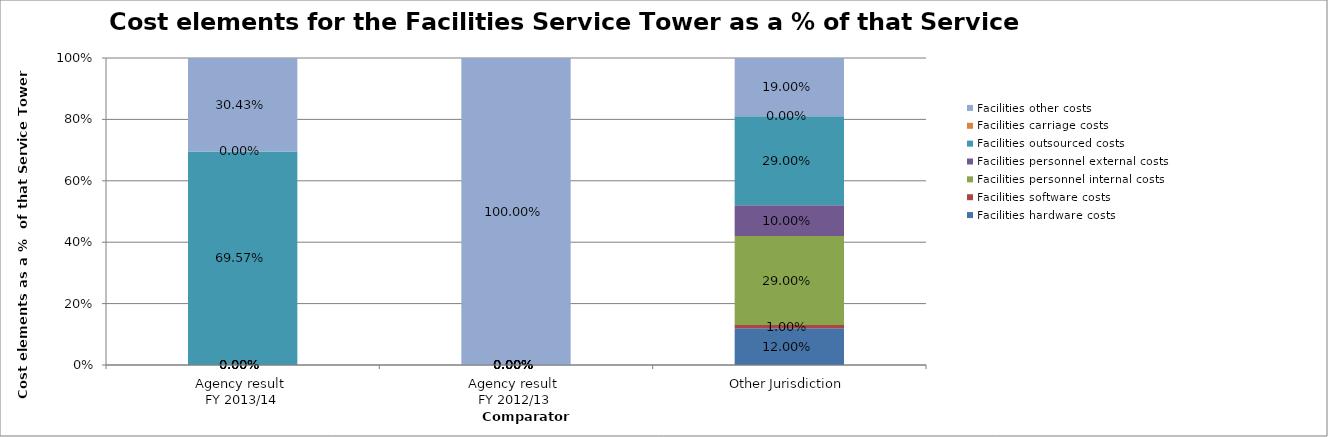
| Category | Facilities hardware costs | Facilities software costs | Facilities personnel internal costs | Facilities personnel external costs | Facilities outsourced costs | Facilities carriage costs | Facilities other costs |
|---|---|---|---|---|---|---|---|
| Agency result 
FY 2013/14 | 0 | 0 | 0 | 0 | 0.696 | 0 | 0.304 |
| Agency result 
FY 2012/13 | 0 | 0 | 0 | 0 | 0 | 0 | 1 |
| Other Jurisdiction | 0.12 | 0.01 | 0.29 | 0.1 | 0.29 | 0 | 0.19 |